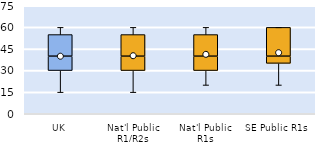
| Category | 25th | 50th | 75th |
|---|---|---|---|
| UK | 30 | 10 | 15 |
| Nat'l Public R1/R2s | 30 | 10 | 15 |
| Nat'l Public R1s | 30 | 10 | 15 |
| SE Public R1s | 35 | 5 | 20 |